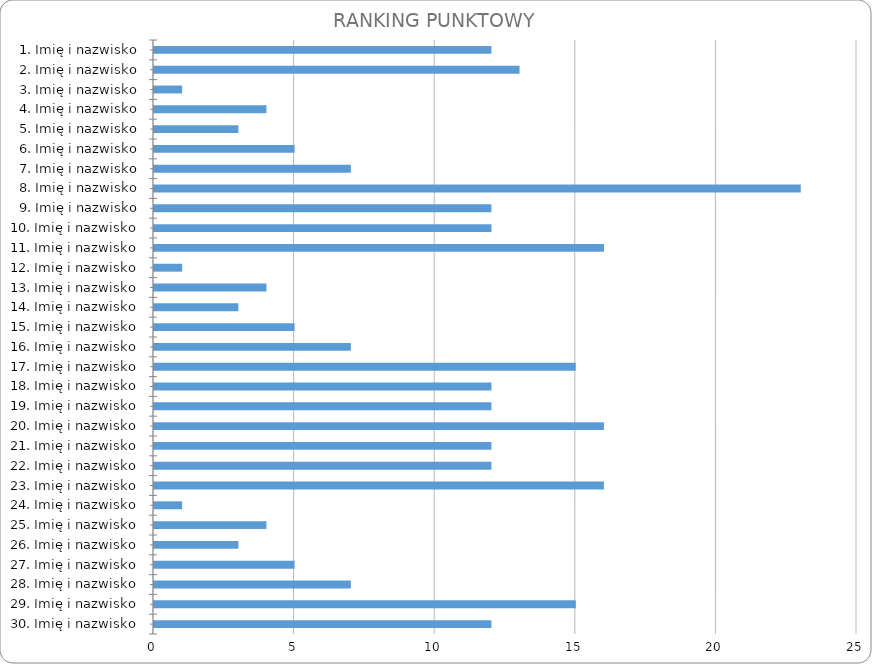
| Category | Series 0 |
|---|---|
| 1. Imię i nazwisko | 12 |
| 2. Imię i nazwisko | 13 |
| 3. Imię i nazwisko | 1 |
| 4. Imię i nazwisko | 4 |
| 5. Imię i nazwisko | 3 |
| 6. Imię i nazwisko | 5 |
| 7. Imię i nazwisko | 7 |
| 8. Imię i nazwisko | 23 |
| 9. Imię i nazwisko | 12 |
| 10. Imię i nazwisko | 12 |
| 11. Imię i nazwisko | 16 |
| 12. Imię i nazwisko | 1 |
| 13. Imię i nazwisko | 4 |
| 14. Imię i nazwisko | 3 |
| 15. Imię i nazwisko | 5 |
| 16. Imię i nazwisko | 7 |
| 17. Imię i nazwisko | 15 |
| 18. Imię i nazwisko | 12 |
| 19. Imię i nazwisko | 12 |
| 20. Imię i nazwisko | 16 |
| 21. Imię i nazwisko | 12 |
| 22. Imię i nazwisko | 12 |
| 23. Imię i nazwisko | 16 |
| 24. Imię i nazwisko | 1 |
| 25. Imię i nazwisko | 4 |
| 26. Imię i nazwisko | 3 |
| 27. Imię i nazwisko | 5 |
| 28. Imię i nazwisko | 7 |
| 29. Imię i nazwisko | 15 |
| 30. Imię i nazwisko | 12 |